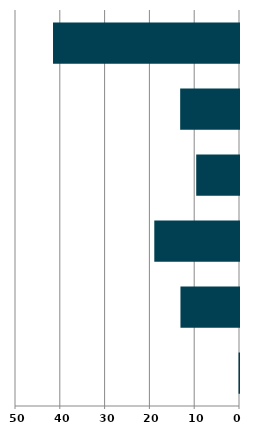
| Category | Series 0 |
|---|---|
| 0 | 0.099 |
| 1 | 13.069 |
| 2 | 18.908 |
| 3 | 9.549 |
| 4 | 13.13 |
| 5 | 41.514 |